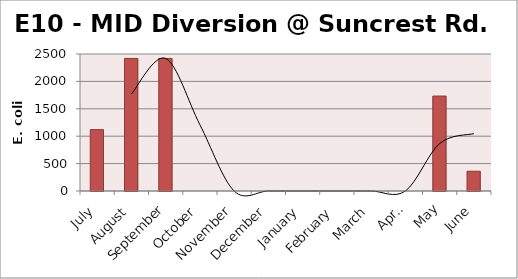
| Category | E. coli MPN |
|---|---|
| July | 1119.9 |
| August | 2419.2 |
| September | 2419.2 |
| October | 0 |
| November | 0 |
| December | 0 |
| January | 0 |
| February | 0 |
| March | 0 |
| April | 0 |
| May | 1732.9 |
| June | 360.9 |